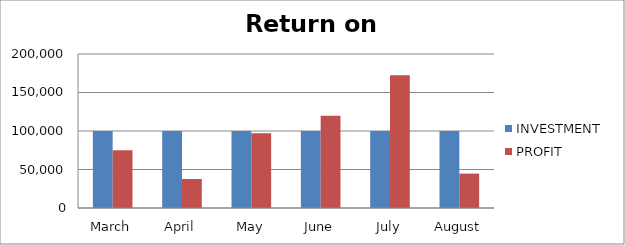
| Category | INVESTMENT  | PROFIT |
|---|---|---|
| March | 100000 | 75108 |
| April | 100000 | 37674 |
| May | 100000 | 97001 |
| June | 100000 | 119705 |
| July | 100000 | 172291 |
| August | 100000 | 44682 |